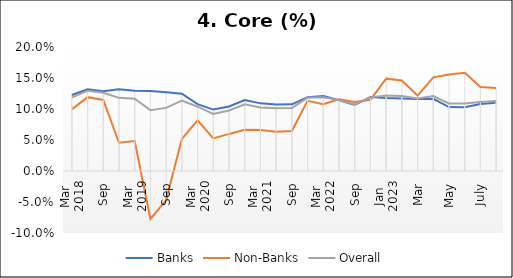
| Category | Banks | Non-Banks | Overall |
|---|---|---|---|
| 0 | 0.123 | 0.099 | 0.118 |
| 1 | 0.132 | 0.119 | 0.13 |
| 2 | 0.128 | 0.115 | 0.126 |
| 3 | 0.132 | 0.046 | 0.118 |
| 4 | 0.13 | 0.048 | 0.117 |
| 5 | 0.129 | -0.077 | 0.098 |
| 6 | 0.127 | -0.047 | 0.102 |
| 7 | 0.125 | 0.052 | 0.114 |
| 8 | 0.108 | 0.082 | 0.104 |
| 9 | 0.099 | 0.053 | 0.092 |
| 10 | 0.104 | 0.06 | 0.098 |
| 11 | 0.114 | 0.066 | 0.108 |
| 12 | 0.109 | 0.066 | 0.102 |
| 13 | 0.107 | 0.063 | 0.101 |
| 14 | 0.108 | 0.064 | 0.102 |
| 15 | 0.119 | 0.113 | 0.118 |
| 16 | 0.121 | 0.108 | 0.119 |
| 17 | 0.114 | 0.116 | 0.114 |
| 18 | 0.107 | 0.111 | 0.107 |
| 19 | 0.119 | 0.115 | 0.119 |
| 20 | 0.118 | 0.149 | 0.122 |
| 21 | 0.117 | 0.146 | 0.121 |
| 22 | 0.116 | 0.122 | 0.117 |
| 23 | 0.116 | 0.151 | 0.121 |
| 24 | 0.103 | 0.156 | 0.109 |
| 25 | 0.103 | 0.159 | 0.109 |
| 26 | 0.108 | 0.135 | 0.111 |
| 27 | 0.11 | 0.134 | 0.113 |